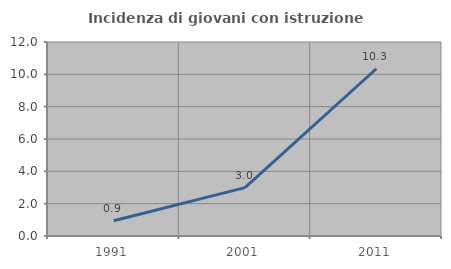
| Category | Incidenza di giovani con istruzione universitaria |
|---|---|
| 1991.0 | 0.943 |
| 2001.0 | 2.994 |
| 2011.0 | 10.345 |